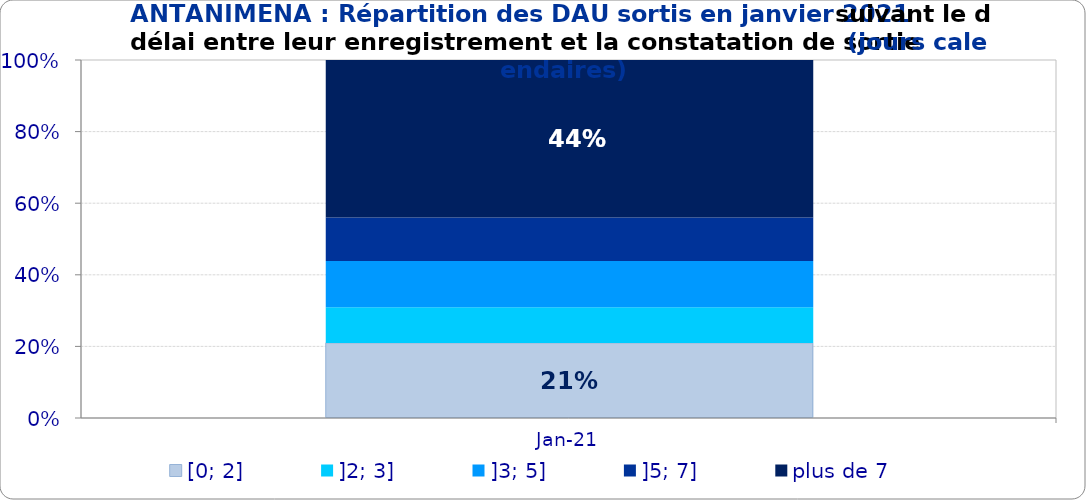
| Category | [0; 2] | ]2; 3] | ]3; 5] | ]5; 7] | plus de 7 |
|---|---|---|---|---|---|
| 2021-01-01 | 0.21 | 0.1 | 0.129 | 0.122 | 0.44 |